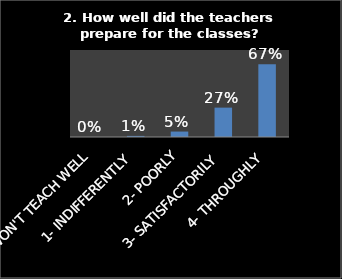
| Category | Series 0 |
|---|---|
| 0- WON'T TEACH WELL | 0 |
| 1- INDIFFERENTLY | 0.01 |
| 2- POORLY | 0.05 |
| 3- SATISFACTORILY | 0.27 |
| 4- THROUGHLY | 0.67 |